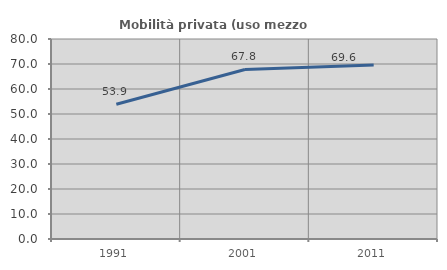
| Category | Mobilità privata (uso mezzo privato) |
|---|---|
| 1991.0 | 53.91 |
| 2001.0 | 67.829 |
| 2011.0 | 69.649 |